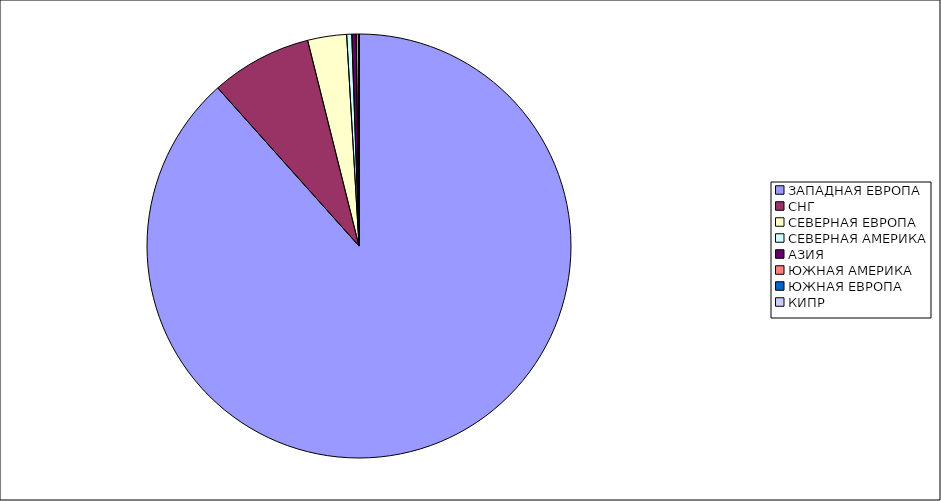
| Category | Оборот |
|---|---|
| ЗАПАДНАЯ ЕВРОПА | 0.884 |
| СНГ | 0.077 |
| СЕВЕРНАЯ ЕВРОПА | 0.03 |
| СЕВЕРНАЯ АМЕРИКА | 0.004 |
| АЗИЯ | 0.003 |
| ЮЖНАЯ АМЕРИКА | 0.002 |
| ЮЖНАЯ ЕВРОПА | 0 |
| КИПР | 0 |